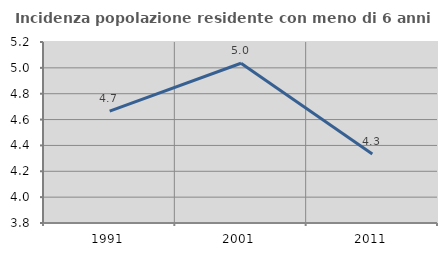
| Category | Incidenza popolazione residente con meno di 6 anni |
|---|---|
| 1991.0 | 4.666 |
| 2001.0 | 5.036 |
| 2011.0 | 4.333 |